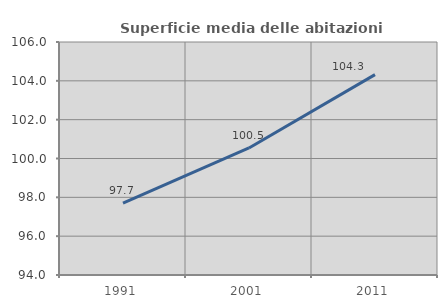
| Category | Superficie media delle abitazioni occupate |
|---|---|
| 1991.0 | 97.708 |
| 2001.0 | 100.543 |
| 2011.0 | 104.322 |